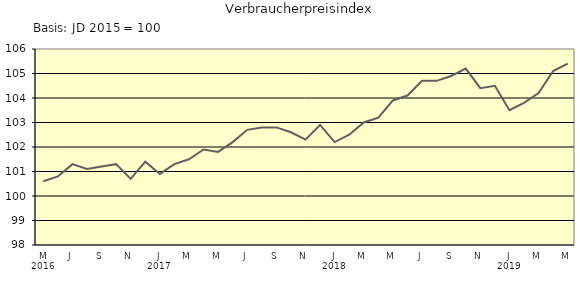
| Category | Series 0 |
|---|---|
| 0 | 100.6 |
| 1 | 100.8 |
| 2 | 101.3 |
| 3 | 101.1 |
| 4 | 101.2 |
| 5 | 101.3 |
| 6 | 100.7 |
| 7 | 101.4 |
| 8 | 100.9 |
| 9 | 101.3 |
| 10 | 101.5 |
| 11 | 101.9 |
| 12 | 101.8 |
| 13 | 102.2 |
| 14 | 102.7 |
| 15 | 102.8 |
| 16 | 102.8 |
| 17 | 102.6 |
| 18 | 102.3 |
| 19 | 102.9 |
| 20 | 102.2 |
| 21 | 102.5 |
| 22 | 103 |
| 23 | 103.2 |
| 24 | 103.9 |
| 25 | 104.1 |
| 26 | 104.7 |
| 27 | 104.7 |
| 28 | 104.9 |
| 29 | 105.2 |
| 30 | 104.4 |
| 31 | 104.5 |
| 32 | 103.5 |
| 33 | 103.8 |
| 34 | 104.2 |
| 35 | 105.1 |
| 36 | 105.4 |